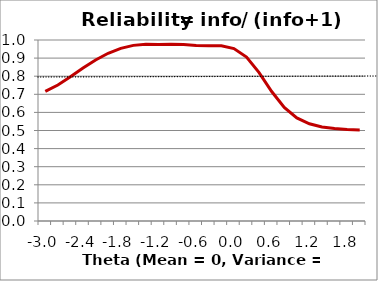
| Category | Reliability |
|---|---|
| -3.0 | 0.716 |
| -2.8 | 0.752 |
| -2.6 | 0.796 |
| -2.4 | 0.845 |
| -2.2 | 0.89 |
| -2.0 | 0.927 |
| -1.8 | 0.954 |
| -1.6 | 0.97 |
| -1.4 | 0.976 |
| -1.2 | 0.976 |
| -1.0 | 0.976 |
| -0.8 | 0.975 |
| -0.6 | 0.97 |
| -0.4 | 0.968 |
| -0.2 | 0.968 |
| 0.0 | 0.953 |
| 0.2 | 0.906 |
| 0.4 | 0.82 |
| 0.6 | 0.715 |
| 0.8 | 0.627 |
| 1.0 | 0.57 |
| 1.2 | 0.537 |
| 1.4 | 0.52 |
| 1.6 | 0.511 |
| 1.8 | 0.506 |
| 2.0 | 0.503 |